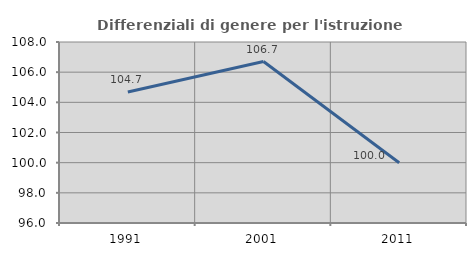
| Category | Differenziali di genere per l'istruzione superiore |
|---|---|
| 1991.0 | 104.689 |
| 2001.0 | 106.705 |
| 2011.0 | 99.992 |